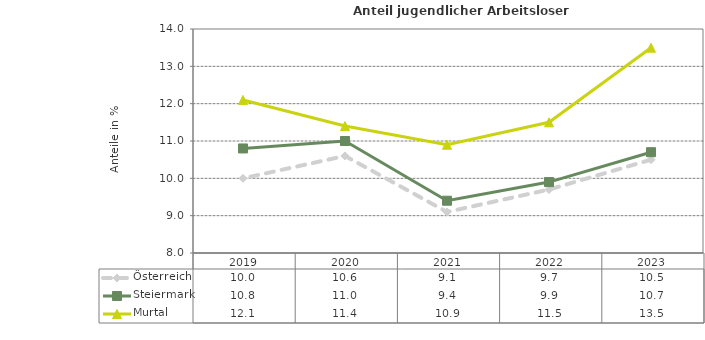
| Category | Österreich | Steiermark | Murtal |
|---|---|---|---|
| 2023.0 | 10.5 | 10.7 | 13.5 |
| 2022.0 | 9.7 | 9.9 | 11.5 |
| 2021.0 | 9.1 | 9.4 | 10.9 |
| 2020.0 | 10.6 | 11 | 11.4 |
| 2019.0 | 10 | 10.8 | 12.1 |